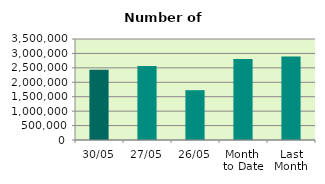
| Category | Series 0 |
|---|---|
| 30/05 | 2437418 |
| 27/05 | 2566146 |
| 26/05 | 1726626 |
| Month 
to Date | 2803717.143 |
| Last
Month | 2895009.158 |